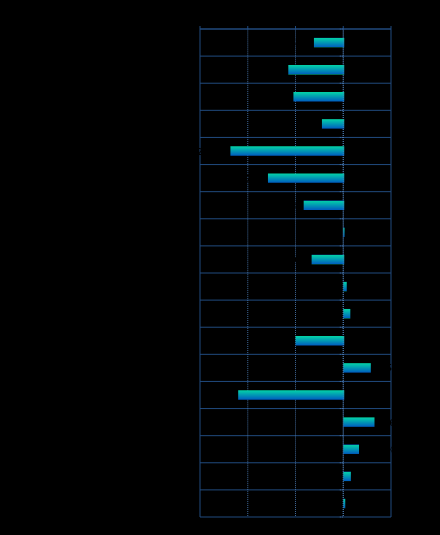
| Category | Series 0 |
|---|---|
| E-Mini S&P 500, Mar 13 | -0.006 |
| E-mini NASDAQ 100, Mar 13 | -0.012 |
| E-mini MidCap 400, Mar 13 | -0.01 |
| E-Mini Dow Futures - $5 Multiplier, Mar 13 | -0.004 |
| Crude Light (Globex), Apr 13 | -0.024 |
| Heating Oil (Globex), Apr 13 | -0.016 |
| RBOB Gasoline (Globex), Apr 13 | -0.008 |
| Gold (Globex), Apr 13 | 0 |
| Euro FX (Globex), Mar 13 | -0.007 |
| British Pound (Globex), Mar 13 | 0.001 |
| Australian Dollar (Globex), Mar 13 | 0.001 |
| Corn (Globex), Mar 13 | -0.01 |
| Soybeans (Globex), Mar 13 | 0.006 |
| Wheat (Globex), Mar 13 | -0.022 |
| 30yr US Treasury Bonds (Globex), Mar 13 | 0.006 |
| 10yr US Treasury Notes (Globex), Mar 13 | 0.003 |
| 5 Year US Treasury Notes (Globex), Mar 13 | 0.001 |
| 2 Year US Treasury Note (Globex), Mar 13 | 0 |